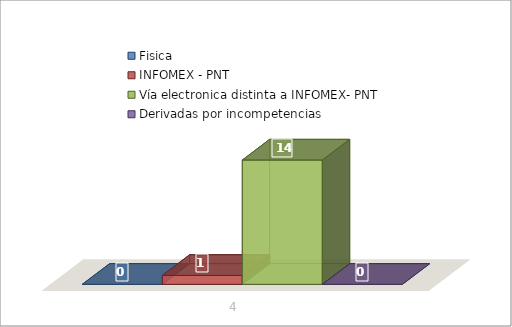
| Category | Fisica | INFOMEX - PNT | Vía electronica distinta a INFOMEX- PNT | Derivadas por incompetencias |
|---|---|---|---|---|
| 0 | 0 | 1 | 14 | 0 |